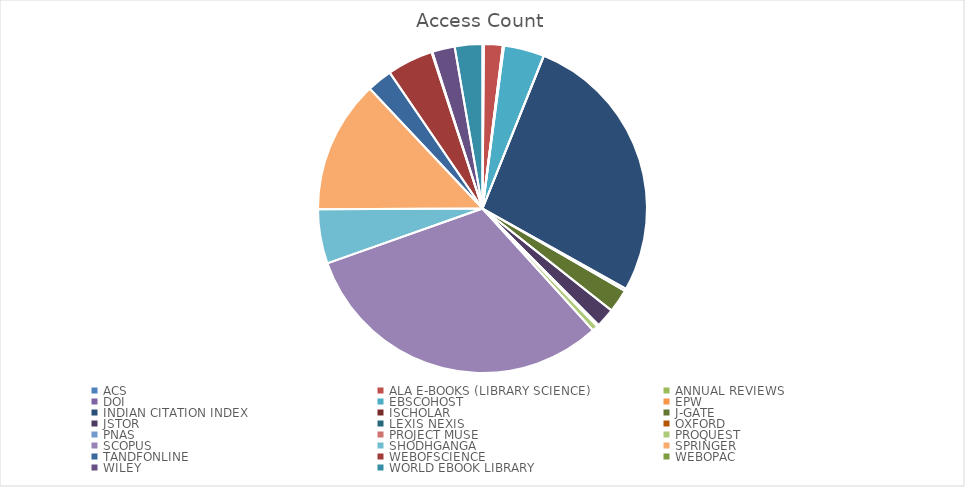
| Category | Access Count |
|---|---|
| ACS | 43 |
| ALA E-BOOKS (LIBRARY SCIENCE) | 601 |
| ANNUAL REVIEWS | 9 |
| DOI | 30 |
| EBSCOHOST | 1296 |
| EPW | 6 |
| INDIAN CITATION INDEX | 8815 |
| ISCHOLAR | 76 |
| J-GATE | 746 |
| JSTOR | 618 |
| LEXIS NEXIS | 2 |
| OXFORD | 12 |
| PNAS | 11 |
| PROJECT MUSE | 26 |
| PROQUEST | 188 |
| SCOPUS | 10212 |
| SHODHGANGA | 1737 |
| SPRINGER | 4261 |
| TANDFONLINE | 808 |
| WEBOFSCIENCE | 1474 |
| WEBOPAC | 26 |
| WILEY | 723 |
| WORLD EBOOK LIBRARY | 886 |